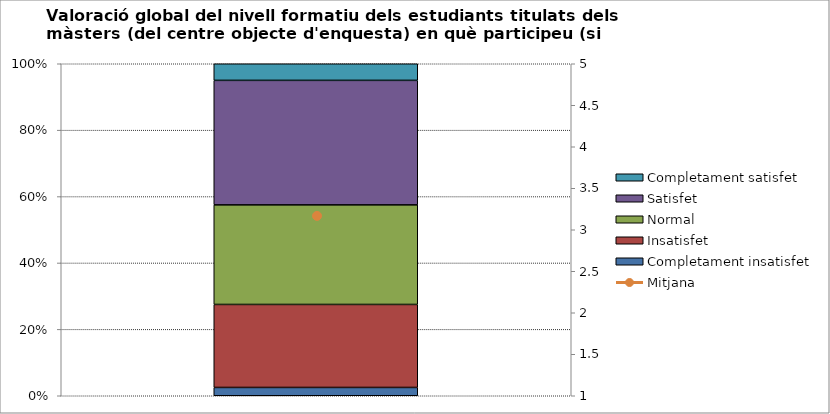
| Category | Completament insatisfet | Insatisfet | Normal | Satisfet | Completament satisfet |
|---|---|---|---|---|---|
| 0 | 1 | 10 | 12 | 15 | 2 |